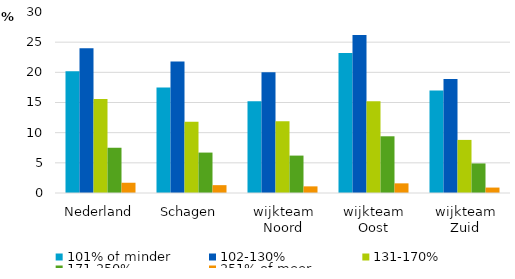
| Category | 101% of minder | 102-130% | 131-170% | 171-250% | 251% of meer |
|---|---|---|---|---|---|
| Nederland | 20.2 | 24 | 15.6 | 7.5 | 1.7 |
| Schagen | 17.5 | 21.8 | 11.8 | 6.7 | 1.3 |
| wijkteam Noord | 15.2 | 20 | 11.9 | 6.2 | 1.1 |
| wijkteam Oost | 23.2 | 26.2 | 15.2 | 9.4 | 1.6 |
| wijkteam Zuid | 17 | 18.9 | 8.8 | 4.9 | 0.9 |